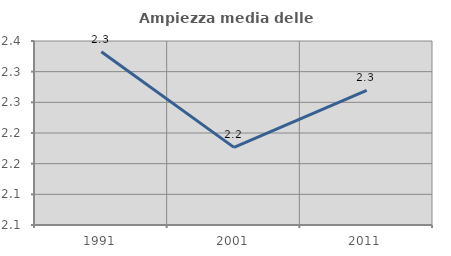
| Category | Ampiezza media delle famiglie |
|---|---|
| 1991.0 | 2.333 |
| 2001.0 | 2.177 |
| 2011.0 | 2.27 |